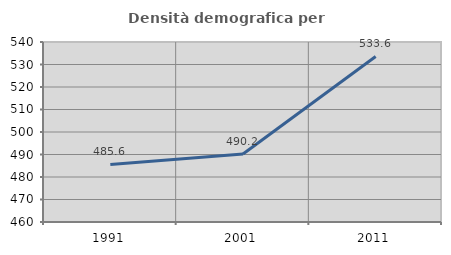
| Category | Densità demografica |
|---|---|
| 1991.0 | 485.606 |
| 2001.0 | 490.196 |
| 2011.0 | 533.571 |